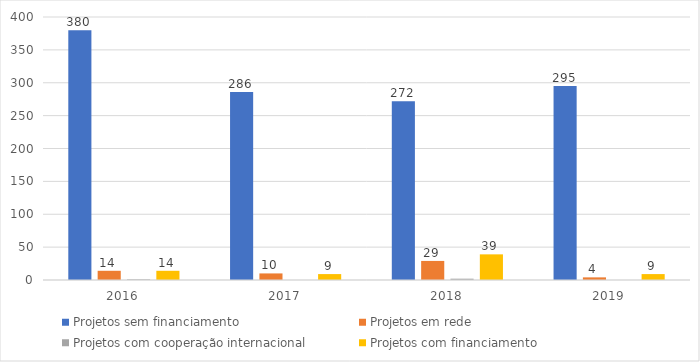
| Category | Projetos sem financiamento | Projetos em rede | Projetos com cooperação internacional  | Projetos com financiamento |
|---|---|---|---|---|
| 2016.0 | 380 | 14 | 1 | 14 |
| 2017.0 | 286 | 10 | 0 | 9 |
| 2018.0 | 272 | 29 | 2 | 39 |
| 2019.0 | 295 | 4 | 0 | 9 |